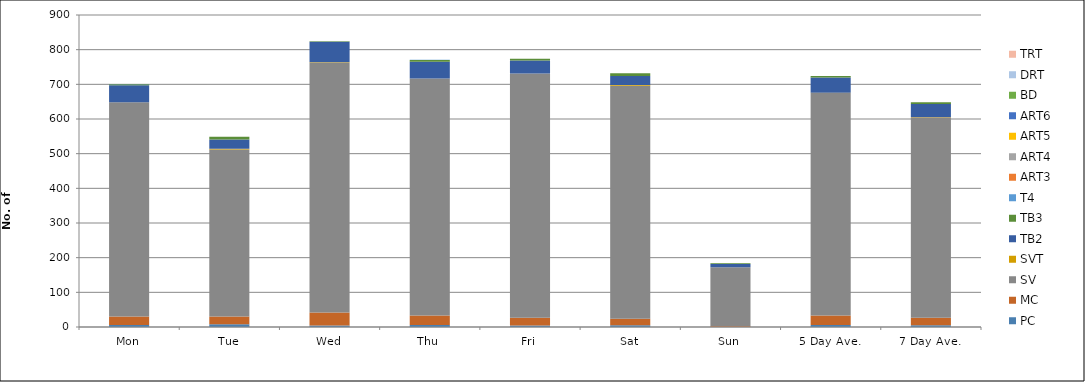
| Category | PC | MC | SV | SVT | TB2 | TB3 | T4 | ART3 | ART4 | ART5 | ART6 | BD | DRT | TRT |
|---|---|---|---|---|---|---|---|---|---|---|---|---|---|---|
| Mon | 6 | 24 | 618 | 0 | 49 | 3 | 1 | 0 | 0 | 0 | 0 | 0 | 0 | 0 |
| Tue | 8 | 22 | 482 | 2 | 27 | 8 | 0 | 0 | 0 | 0 | 0 | 0 | 0 | 0 |
| Wed | 4 | 38 | 720 | 2 | 59 | 1 | 0 | 0 | 0 | 0 | 0 | 0 | 0 | 0 |
| Thu | 6 | 27 | 684 | 0 | 48 | 5 | 1 | 0 | 0 | 0 | 0 | 0 | 0 | 0 |
| Fri | 4 | 23 | 704 | 0 | 38 | 5 | 0 | 0 | 0 | 0 | 0 | 0 | 0 | 0 |
| Sat | 5 | 19 | 672 | 2 | 26 | 8 | 0 | 0 | 0 | 0 | 0 | 0 | 0 | 0 |
| Sun | 1 | 2 | 169 | 0 | 10 | 2 | 0 | 0 | 0 | 0 | 0 | 0 | 0 | 0 |
| 5 Day Ave. | 6 | 27 | 642 | 1 | 44 | 4 | 0 | 0 | 0 | 0 | 0 | 0 | 0 | 0 |
| 7 Day Ave. | 5 | 22 | 578 | 1 | 37 | 5 | 0 | 0 | 0 | 0 | 0 | 0 | 0 | 0 |